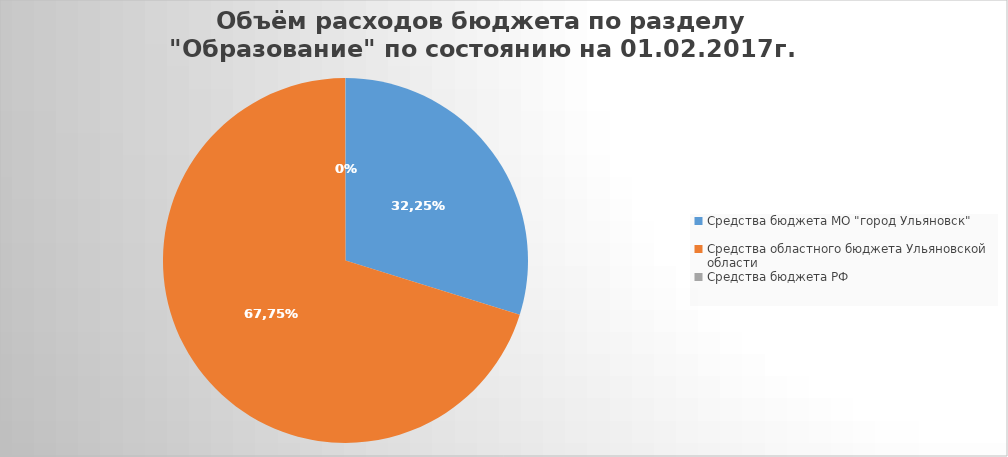
| Category | Series 0 |
|---|---|
| Средства бюджета МО "город Ульяновск" | 1388837.6 |
| Средства областного бюджета Ульяновской области | 3269523.7 |
| Средства бюджета РФ | 1860.1 |